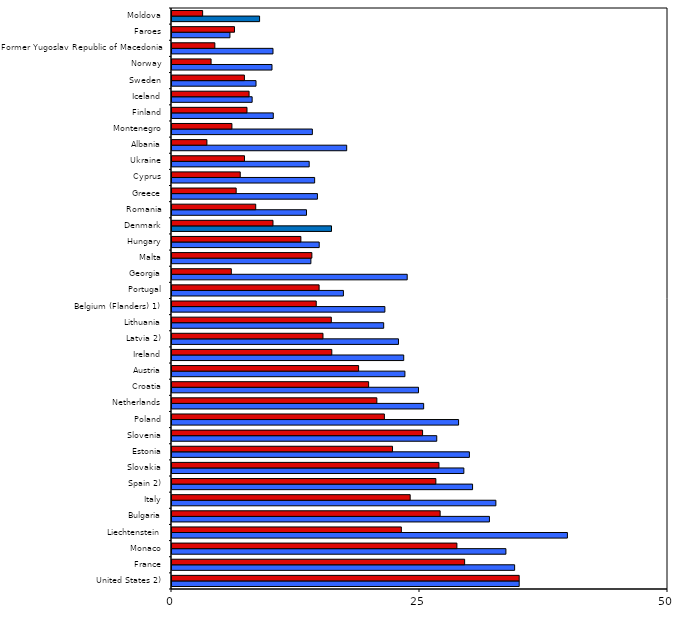
| Category | Boys | Girls |
|---|---|---|
| United States 2) | 35 | 35 |
| France | 34.54 | 29.5 |
| Monaco | 33.66 | 28.72 |
| Liechtenstein | 39.86 | 23.12 |
| Bulgaria | 32 | 27.03 |
| Italy | 32.65 | 24.01 |
| Spain 2) | 30.3 | 26.6 |
| Slovakia | 29.42 | 26.91 |
| Estonia | 29.98 | 22.23 |
| Slovenia | 26.69 | 25.26 |
| Poland | 28.89 | 21.41 |
| Netherlands | 25.37 | 20.65 |
| Croatia | 24.85 | 19.82 |
| Austria | 23.48 | 18.81 |
| Ireland | 23.36 | 16.11 |
| Latvia 2) | 22.83 | 15.22 |
| Lithuania | 21.34 | 16.06 |
| Belgium (Flanders) 1) | 21.46 | 14.54 |
| Portugal | 17.28 | 14.83 |
| Georgia | 23.71 | 5.98 |
| Malta | 14 | 14.1 |
| Hungary | 14.84 | 12.99 |
| Denmark | 16.08 | 10.18 |
| Romania | 13.56 | 8.44 |
| Greece | 14.66 | 6.47 |
| Cyprus | 14.38 | 6.88 |
| Ukraine | 13.83 | 7.31 |
| Albania | 17.61 | 3.52 |
| Montenegro | 14.15 | 6.04 |
| Finland | 10.21 | 7.56 |
| Iceland | 8.08 | 7.77 |
| Sweden | 8.47 | 7.3 |
| Norway | 10.08 | 3.94 |
| Former Yugoslav Republic of Macedonia | 10.18 | 4.32 |
| Faroes | 5.84 | 6.3 |
| Moldova | 8.83 | 3.09 |